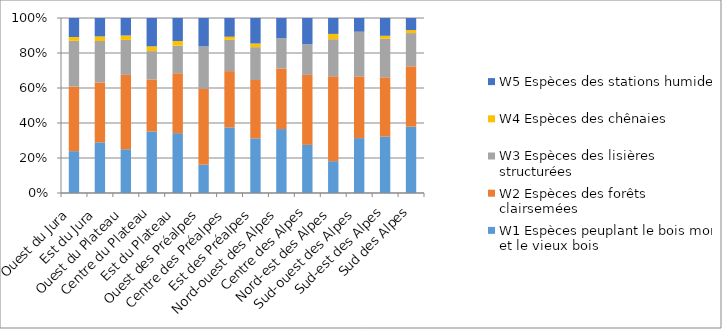
| Category | W1 Espèces peuplant le bois mort et le vieux bois | W2 Espèces des forêts clairsemées | W3 Espèces des lisières structurées | W4 Espèces des chênaies | W5 Espèces des stations humides |
|---|---|---|---|---|---|
| Ouest du Jura | 11 | 17 | 12 | 1 | 5 |
| Est du Jura | 11 | 13 | 9 | 1 | 4 |
| Ouest du Plateau | 10 | 17 | 8 | 1 | 4 |
| Centre du Plateau | 13 | 11 | 6 | 1 | 6 |
| Est du Plateau | 13 | 13 | 6 | 1 | 5 |
| Ouest des Préalpes | 6 | 16 | 9 | 0 | 6 |
| Centre des Préalpes | 21 | 18 | 10 | 1 | 6 |
| Est des Préalpes | 15 | 16 | 9 | 1 | 7 |
| Nord-ouest des Alpes | 19 | 18 | 9 | 0 | 6 |
| Centre des Alpes | 11 | 16 | 7 | 0 | 6 |
| Nord-est des Alpes | 6 | 16 | 7 | 1 | 3 |
| Sud-ouest des Alpes | 16 | 18 | 13 | 0 | 4 |
| Sud-est des Alpes | 19 | 20 | 13 | 1 | 6 |
| Sud des Alpes | 22 | 20 | 11 | 1 | 4 |